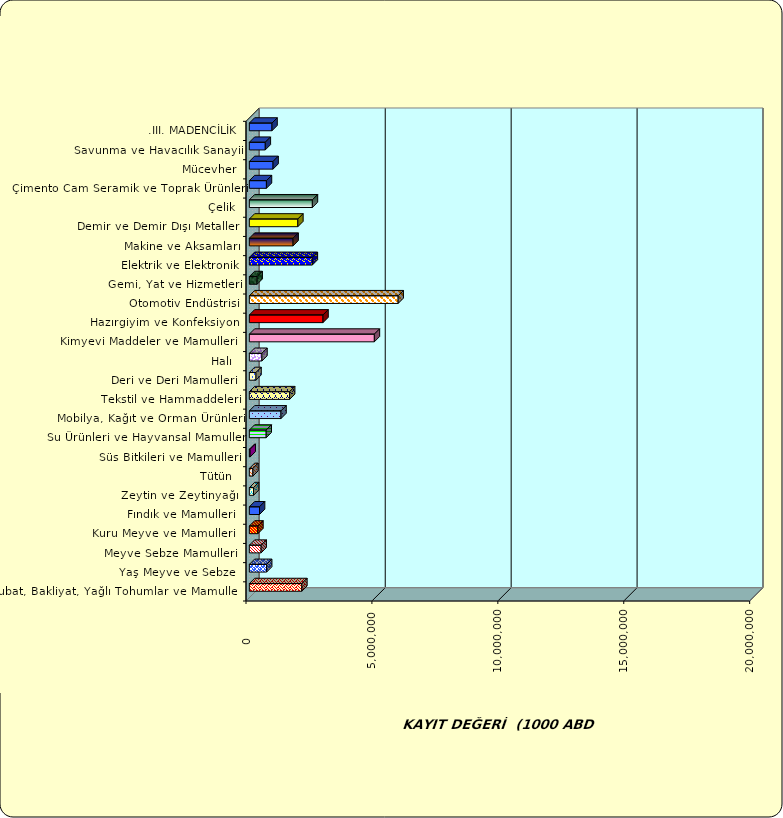
| Category | Series 0 |
|---|---|
|  Hububat, Bakliyat, Yağlı Tohumlar ve Mamulleri  | 2083225.753 |
|  Yaş Meyve ve Sebze   | 686448.254 |
|  Meyve Sebze Mamulleri  | 467551.004 |
|  Kuru Meyve ve Mamulleri   | 338917.843 |
|  Fındık ve Mamulleri  | 403793.274 |
|  Zeytin ve Zeytinyağı  | 166366.889 |
|  Tütün  | 140786.783 |
|  Süs Bitkileri ve Mamulleri | 31478.161 |
|  Su Ürünleri ve Hayvansal Mamuller | 668662.636 |
|  Mobilya, Kağıt ve Orman Ürünleri | 1256347.607 |
|  Tekstil ve Hammaddeleri | 1598176.93 |
|  Deri ve Deri Mamulleri  | 263678.572 |
|  Halı  | 499567.852 |
|  Kimyevi Maddeler ve Mamulleri   | 4964336.14 |
|  Hazırgiyim ve Konfeksiyon  | 2924193.73 |
|  Otomotiv Endüstrisi | 5908633.928 |
|  Gemi, Yat ve Hizmetleri | 308583.779 |
|  Elektrik ve Elektronik | 2500058.12 |
|  Makine ve Aksamları | 1735928.746 |
|  Demir ve Demir Dışı Metaller  | 1925161.042 |
|  Çelik | 2503141.486 |
|  Çimento Cam Seramik ve Toprak Ürünleri | 678239.11 |
|  Mücevher | 941012.723 |
|  Savunma ve Havacılık Sanayii | 632782.874 |
| .III. MADENCİLİK | 899095.569 |